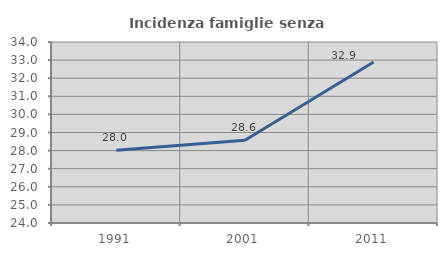
| Category | Incidenza famiglie senza nuclei |
|---|---|
| 1991.0 | 28.024 |
| 2001.0 | 28.571 |
| 2011.0 | 32.891 |